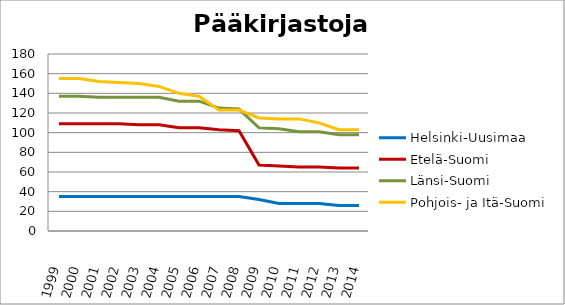
| Category | Helsinki-Uusimaa | Etelä-Suomi | Länsi-Suomi | Pohjois- ja Itä-Suomi |
|---|---|---|---|---|
| 1999.0 | 35 | 109 | 137 | 155 |
| 2000.0 | 35 | 109 | 137 | 155 |
| 2001.0 | 35 | 109 | 136 | 152 |
| 2002.0 | 35 | 109 | 136 | 151 |
| 2003.0 | 35 | 108 | 136 | 150 |
| 2004.0 | 35 | 108 | 136 | 147 |
| 2005.0 | 35 | 105 | 132 | 140 |
| 2006.0 | 35 | 105 | 132 | 137 |
| 2007.0 | 35 | 103 | 125 | 123 |
| 2008.0 | 35 | 102 | 124 | 123 |
| 2009.0 | 32 | 67 | 105 | 115 |
| 2010.0 | 28 | 66 | 104 | 114 |
| 2011.0 | 28 | 65 | 101 | 114 |
| 2012.0 | 28 | 65 | 101 | 110 |
| 2013.0 | 26 | 64 | 98 | 103 |
| 2014.0 | 26 | 64 | 98 | 103 |